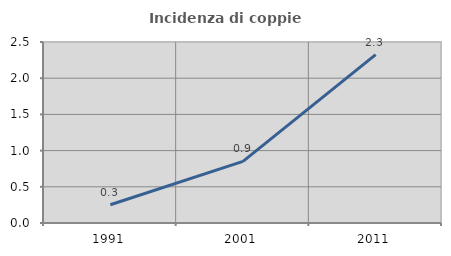
| Category | Incidenza di coppie miste |
|---|---|
| 1991.0 | 0.253 |
| 2001.0 | 0.851 |
| 2011.0 | 2.326 |